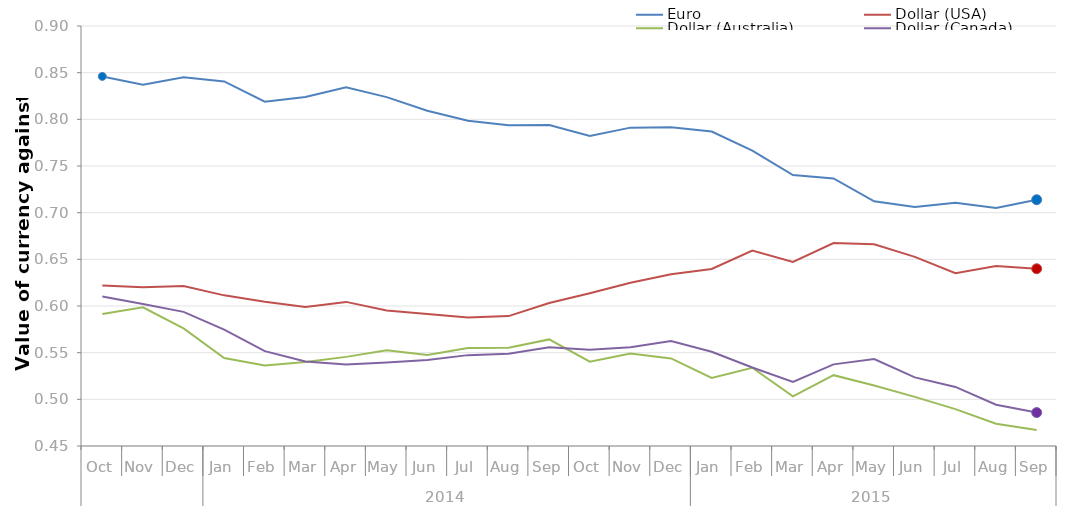
| Category | Euro | Dollar (USA) | Dollar (Australia) | Dollar (Canada) |
|---|---|---|---|---|
| 0 | 0.846 | 0.622 | 0.591 | 0.61 |
| 1 | 0.837 | 0.62 | 0.599 | 0.602 |
| 2 | 0.845 | 0.621 | 0.576 | 0.594 |
| 3 | 0.841 | 0.611 | 0.544 | 0.575 |
| 4 | 0.819 | 0.605 | 0.536 | 0.552 |
| 5 | 0.824 | 0.599 | 0.54 | 0.541 |
| 6 | 0.834 | 0.604 | 0.545 | 0.537 |
| 7 | 0.824 | 0.595 | 0.552 | 0.539 |
| 8 | 0.809 | 0.592 | 0.548 | 0.542 |
| 9 | 0.798 | 0.588 | 0.555 | 0.547 |
| 10 | 0.794 | 0.589 | 0.555 | 0.549 |
| 11 | 0.794 | 0.603 | 0.564 | 0.556 |
| 12 | 0.782 | 0.614 | 0.54 | 0.553 |
| 13 | 0.791 | 0.625 | 0.549 | 0.556 |
| 14 | 0.791 | 0.634 | 0.544 | 0.562 |
| 15 | 0.787 | 0.64 | 0.523 | 0.551 |
| 16 | 0.766 | 0.659 | 0.534 | 0.534 |
| 17 | 0.74 | 0.647 | 0.503 | 0.519 |
| 18 | 0.737 | 0.668 | 0.526 | 0.537 |
| 19 | 0.712 | 0.666 | 0.515 | 0.543 |
| 20 | 0.706 | 0.653 | 0.503 | 0.524 |
| 21 | 0.711 | 0.635 | 0.49 | 0.513 |
| 22 | 0.705 | 0.643 | 0.474 | 0.494 |
| 23 | 0.714 | 0.64 | 0.467 | 0.486 |